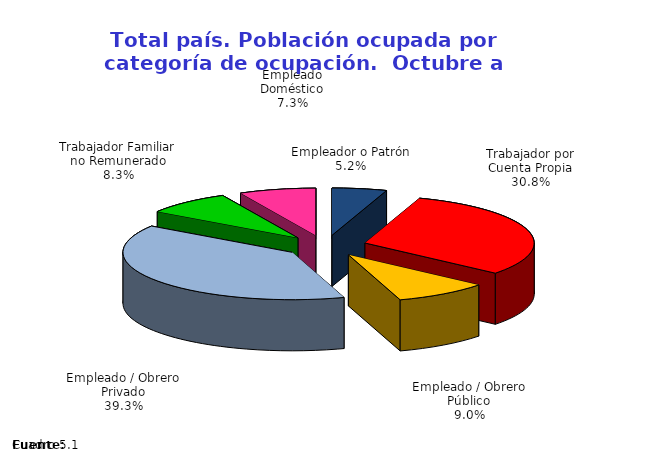
| Category | Series 0 |
|---|---|
| Empleador o Patrón | 5.225 |
| Trabajador por Cuenta Propia | 30.782 |
| Empleado / Obrero Público | 9.042 |
| Empleado / Obrero Privado | 39.333 |
| Trabajador Familiar no Remunerado | 8.282 |
| Empleado Doméstico | 7.337 |